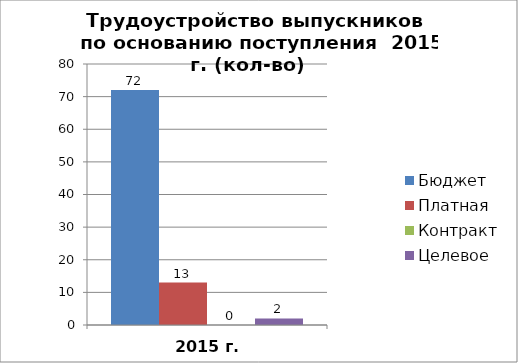
| Category | Бюджет | Платная | Контракт | Целевое |
|---|---|---|---|---|
| 2015 г. | 72 | 13 | 0 | 2 |